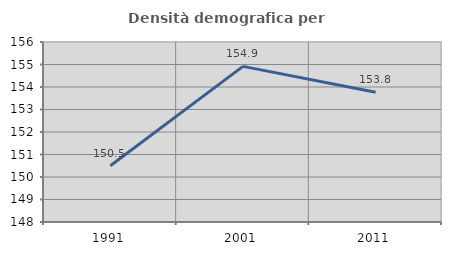
| Category | Densità demografica |
|---|---|
| 1991.0 | 150.499 |
| 2001.0 | 154.916 |
| 2011.0 | 153.767 |